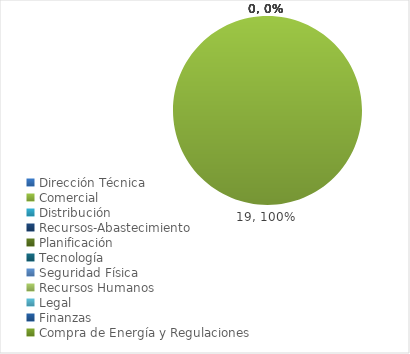
| Category | Series 0 |
|---|---|
| Dirección Técnica | 0 |
| Comercial | 19 |
| Distribución | 0 |
| Recursos-Abastecimiento | 0 |
| Planificación | 0 |
| Tecnología | 0 |
| Seguridad Física | 0 |
| Recursos Humanos | 0 |
| Legal | 0 |
| Finanzas | 0 |
| Compra de Energía y Regulaciones | 0 |